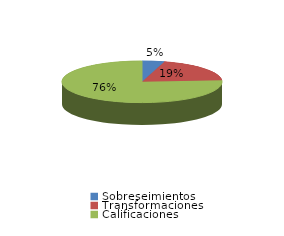
| Category | Series 0 |
|---|---|
| Sobreseimientos | 104 |
| Transformaciones | 446 |
| Calificaciones | 1756 |